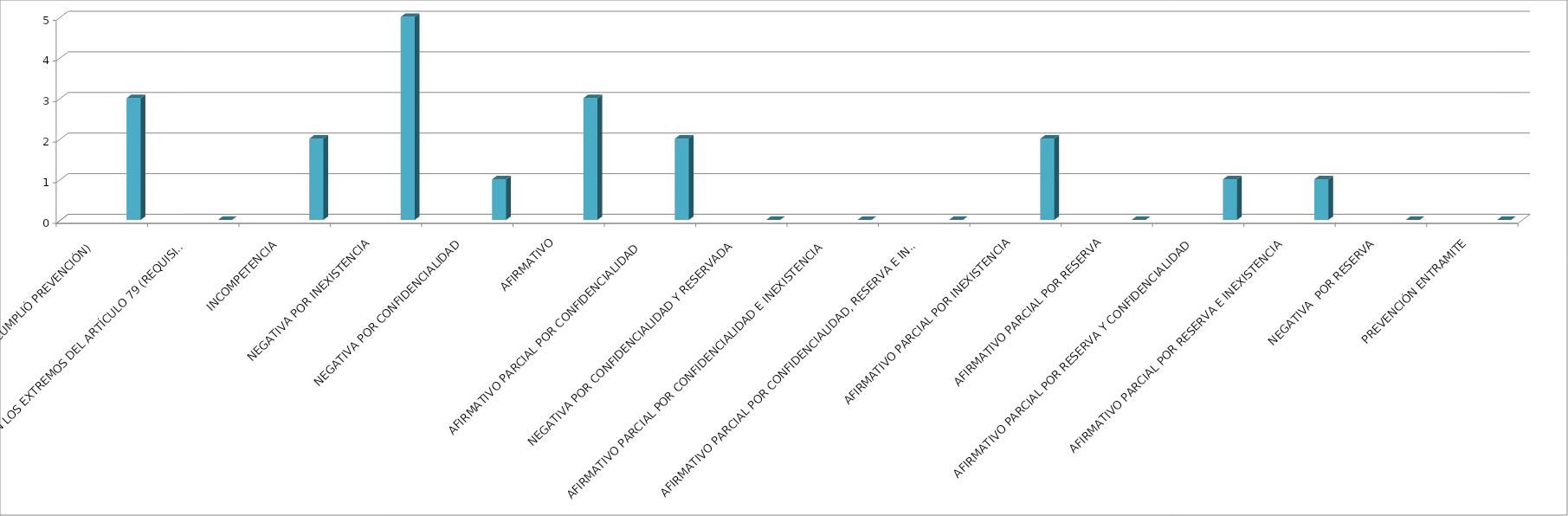
| Category | Series 0 | Series 1 | Series 2 | Series 3 | Series 4 |
|---|---|---|---|---|---|
| SE TIENE POR NO PRESENTADA ( NO CUMPLIÓ PREVENCIÓN) |  |  |  |  | 3 |
| NO CUMPLIO CON LOS EXTREMOS DEL ARTÍCULO 79 (REQUISITOS) |  |  |  |  | 0 |
| INCOMPETENCIA  |  |  |  |  | 2 |
| NEGATIVA POR INEXISTENCIA |  |  |  |  | 5 |
| NEGATIVA POR CONFIDENCIALIDAD |  |  |  |  | 1 |
| AFIRMATIVO |  |  |  |  | 3 |
| AFIRMATIVO PARCIAL POR CONFIDENCIALIDAD  |  |  |  |  | 2 |
| NEGATIVA POR CONFIDENCIALIDAD Y RESERVADA |  |  |  |  | 0 |
| AFIRMATIVO PARCIAL POR CONFIDENCIALIDAD E INEXISTENCIA |  |  |  |  | 0 |
| AFIRMATIVO PARCIAL POR CONFIDENCIALIDAD, RESERVA E INEXISTENCIA |  |  |  |  | 0 |
| AFIRMATIVO PARCIAL POR INEXISTENCIA |  |  |  |  | 2 |
| AFIRMATIVO PARCIAL POR RESERVA |  |  |  |  | 0 |
| AFIRMATIVO PARCIAL POR RESERVA Y CONFIDENCIALIDAD |  |  |  |  | 1 |
| AFIRMATIVO PARCIAL POR RESERVA E INEXISTENCIA |  |  |  |  | 1 |
| NEGATIVA  POR RESERVA |  |  |  |  | 0 |
| PREVENCIÓN ENTRAMITE |  |  |  |  | 0 |